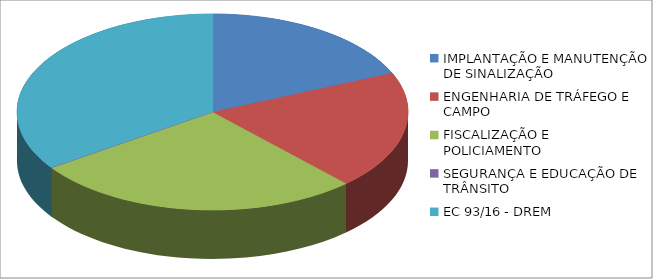
| Category | Series 0 | Series 1 |
|---|---|---|
| IMPLANTAÇÃO E MANUTENÇÃO DE SINALIZAÇÃO | 1963152.73 |  |
| ENGENHARIA DE TRÁFEGO E CAMPO | 2072384.1 |  |
| FISCALIZAÇÃO E POLICIAMENTO | 2895949.52 |  |
| SEGURANÇA E EDUCAÇÃO DE TRÂNSITO | 6288.48 |  |
| EC 93/16 - DREM | 3670924.85 |  |